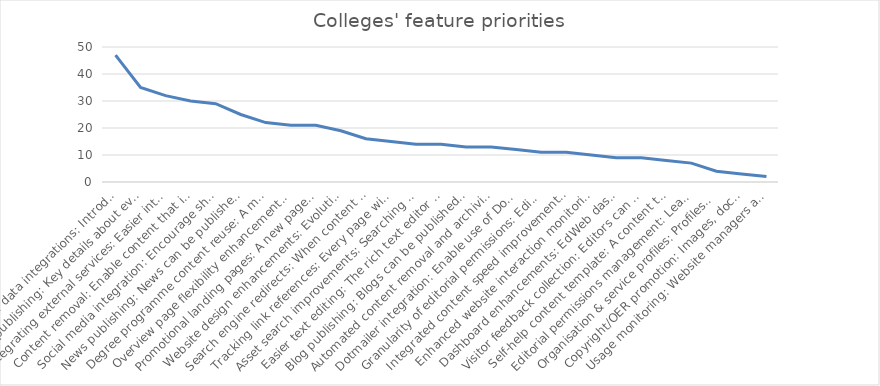
| Category | Series 0 |
|---|---|
| PURE research data integrations: Introduce more opportunities to present information from the Edinburgh Research Explorer in EdWeb-managed web pages, with no technical knowledge needed. (Currently only publication lists possible). | 47 |
| Events publishing: Key details about events can be displayed differently in different contexts, such as the automatic creation of an events calendar. | 35 |
| Integrating external services: Easier integration of services such as Google Maps, You Tube videos, Twitter feeds. Simple URL pasting into EdWeb with no need for interaction with HTML or assets. | 32 |
| Content removal: Enable content that is no longer required or created in error to be removable, reducing unnecessary clutter in the EdWeb content tree for editors. | 30 |
| Social media integration: Encourage sharing of website content via social media buttons, and features to monitor engagement on popular networks. | 29 |
| News publishing: News can be published using a dedicated content type (template); enhancing presentation on different device sizes, allowing more intelligent sharing and promotion in search results. | 25 |
| Degree programme content reuse: A means to re-use and extend golden copy content about degree programmes, that is currently published only via the Degree Finder | 22 |
| Overview page flexibility enhancements: Introduce new layout options to enable overview pages to dynamically present the content below in a range of ways. | 21 |
| Promotional landing pages: A new page type designed for promotional impact and flexibility, which can be used at any point in a site structure. It will work much like a Generic Content page, but have presentational features similar to a homepage. | 21 |
| Website design enhancements: Evolution of design to improve website visitor experience on small devices, bringing greater focus to content over brand & navigation elements and promoting clearer/easier interactions. | 19 |
| Search engine redirects: When content is moved or removed, enable 301 redirects. This reduces the risk of a website visitor receiving a 'Page not found' error from a search result in the period before the site is re-indexed. | 16 |
| Tracking link references: Every page will contain a list of all other EdWeb pages that link to it, so that when it is edited, moved or removed the editor is aware of the impact of their actions on other publishers across the University. | 15 |
| Asset search improvements: Searching for images, documents, videos, content snippets etc is quicker, easier and more efficient. | 14 |
| Easier text editing: The rich text editor is improved, so that it's quicker and easier to make changes to content, to apply stand-out formatting elements and to ensure everything is standards compliant. | 14 |
| Blog publishing: Blogs can be published via EdWeb, with sufficient design changes to distinguish from corporate web content, and new navigation and filtering options typically associated with this kind of content (sort by author, by date, by tag etc). | 13 |
| Automated content removal and archiving: Schedule archiving and permanent removal of unpublished content after given periods to reduce unnecessary clutter and support compliance with records management legislation. | 13 |
| Dotmailer integration: Enable use of Dotmailer through EdWeb as a means to build and manage mailing lists more efficiently. | 12 |
| Granularity of editorial permissions: Editing rights can be restricted to particular subsections or content types, rather than having access to everything in a particular site. | 11 |
| Integrated content speed improvements: Speed up page load times for content being delivered from external systems through EdWeb. | 11 |
| Enhanced website interaction monitoring: Enable use of analytics tools (click heat tracking, A/B testing etc) that provide additional insight into how website visitors are interacting with the website. This informs ongoing content & design improvements. | 10 |
| Dashboard enhancements: EdWeb dashboard is more useful to editors and publishers, speeding up completion of the most common tasks, and can be configured to suit an individual's priorities. | 9 |
| Visitor feedback collection: Editors can collect and view visitor ratings for page content, to identify strengths and quickly correct any errors. | 9 |
| Self-help content template: A content type (template) optimised for presentation of online help and guidance, supporting user self service. | 8 |
| Editorial permissions management: Lead publishers can assign editorial rights on their website to any trained user, without involving EdWeb support. | 7 |
| Organisation & service profiles: Profiles can be published using a dedicated content type (template); enhancing presentation on different device sizes, allowing more intelligent sharing and promotion in search results. | 4 |
| Copyright/OER promotion: Images, documents and other assets can be promoted as Open Educational Resources, encouraging reuse of University materials worldwide. | 3 |
| Usage monitoring: Website managers and EdWeb support services have access to data on editorial and publishing activity, which will support better website management, staffing and user support-related decision making. | 2 |